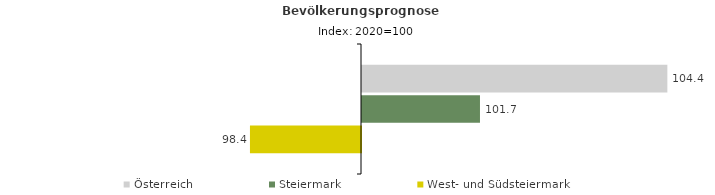
| Category | Österreich | Steiermark | West- und Südsteiermark |
|---|---|---|---|
| 2020.0 | 104.4 | 101.7 | 98.4 |